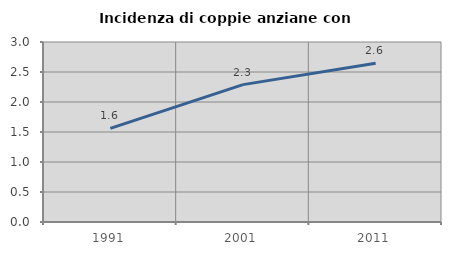
| Category | Incidenza di coppie anziane con figli |
|---|---|
| 1991.0 | 1.56 |
| 2001.0 | 2.29 |
| 2011.0 | 2.646 |